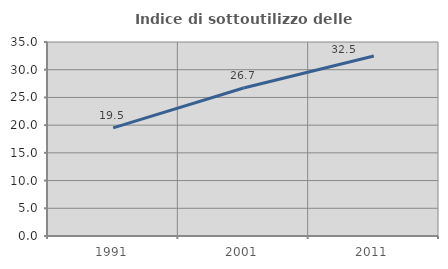
| Category | Indice di sottoutilizzo delle abitazioni  |
|---|---|
| 1991.0 | 19.497 |
| 2001.0 | 26.691 |
| 2011.0 | 32.472 |